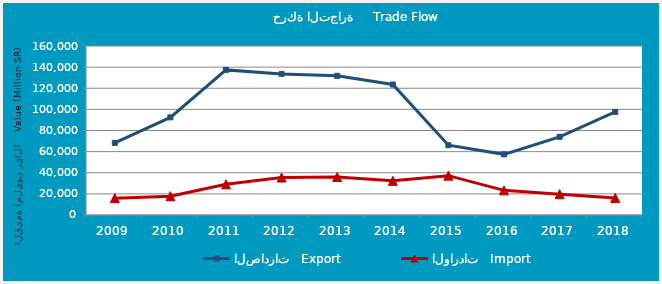
| Category | الصادرات   Export | الواردات   Import |
|---|---|---|
| 2009.0 | 68262759853 | 15931338075 |
| 2010.0 | 92430869450 | 17788584419 |
| 2011.0 | 137391878487 | 29075665356 |
| 2012.0 | 133585016657 | 35467026666 |
| 2013.0 | 131750081966 | 36017849483 |
| 2014.0 | 123557035145 | 32336134716 |
| 2015.0 | 66099106794 | 37250640608 |
| 2016.0 | 57432484570 | 23327730718 |
| 2017.0 | 74026910780 | 19737891416 |
| 2018.0 | 97592176520 | 16195313653 |